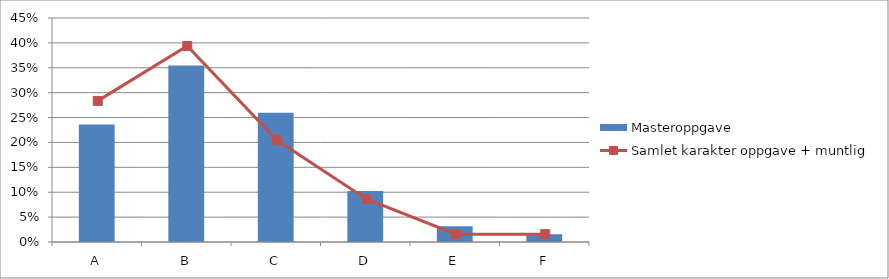
| Category | Masteroppgave |
|---|---|
| A | 0.236 |
| B | 0.354 |
| C | 0.26 |
| D | 0.102 |
| E | 0.031 |
| F | 0.016 |